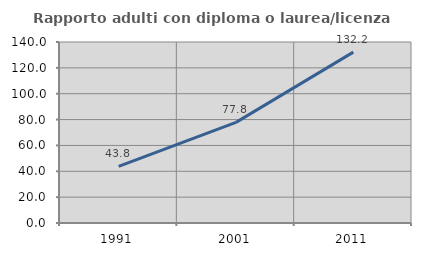
| Category | Rapporto adulti con diploma o laurea/licenza media  |
|---|---|
| 1991.0 | 43.777 |
| 2001.0 | 77.817 |
| 2011.0 | 132.166 |